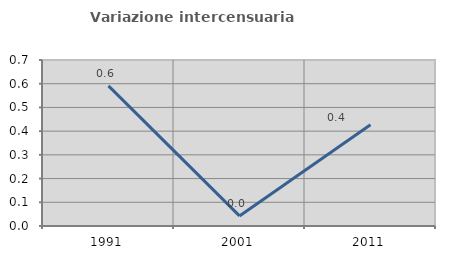
| Category | Variazione intercensuaria annua |
|---|---|
| 1991.0 | 0.591 |
| 2001.0 | 0.042 |
| 2011.0 | 0.427 |